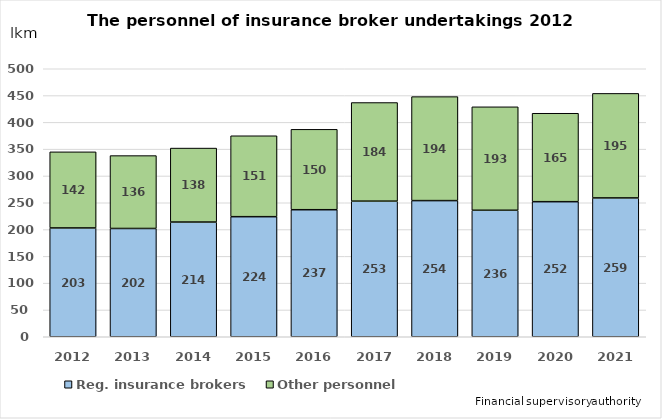
| Category | Reg. insurance brokers | Other personnel |
|---|---|---|
| 2012.0 | 203 | 142 |
| 2013.0 | 202 | 136 |
| 2014.0 | 214 | 138 |
| 2015.0 | 224 | 151 |
| 2016.0 | 237 | 150 |
| 2017.0 | 253 | 184 |
| 2018.0 | 254 | 194 |
| 2019.0 | 236 | 193 |
| 2020.0 | 252 | 165 |
| 2021.0 | 259 | 195 |